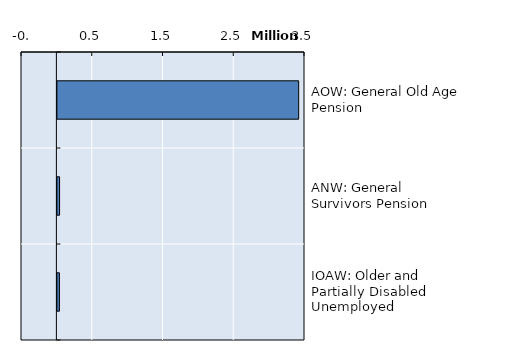
| Category | Series 0 |
|---|---|
| AOW: General Old Age Pension | 3410668.333 |
| ANW: General Survivors Pension | 31110 |
| IOAW: Older and Partially Disabled Unemployed | 28879.17 |